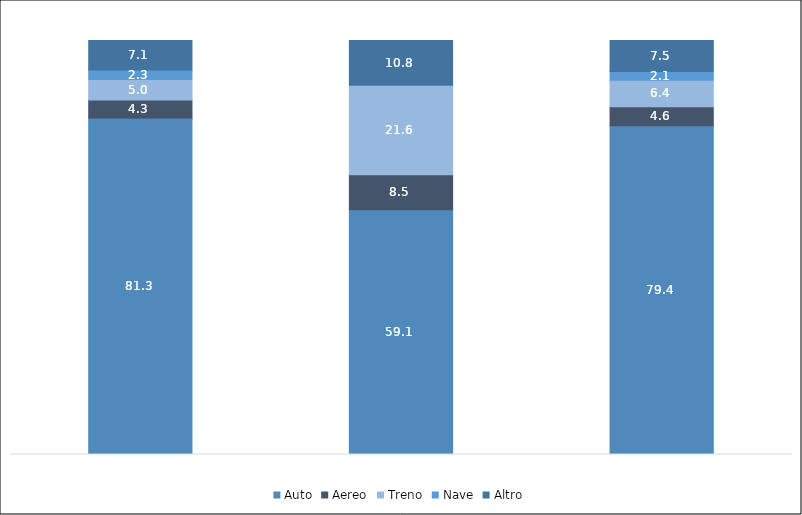
| Category | Auto | Aereo | Treno | Nave | Altro |
|---|---|---|---|---|---|
| VACANZA | 81.3 | 4.3 | 5 | 2.3 | 7.1 |
| LAVORO | 59.1 | 8.5 | 21.6 | 0 | 10.8 |
| TOTALE | 79.4 | 4.6 | 6.4 | 2.1 | 7.5 |